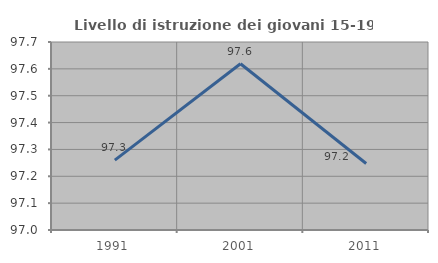
| Category | Livello di istruzione dei giovani 15-19 anni |
|---|---|
| 1991.0 | 97.26 |
| 2001.0 | 97.619 |
| 2011.0 | 97.248 |